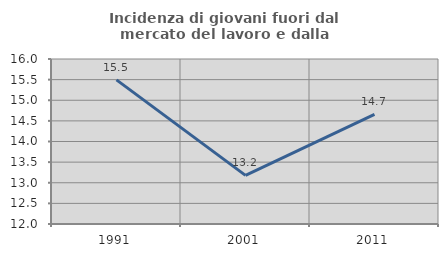
| Category | Incidenza di giovani fuori dal mercato del lavoro e dalla formazione  |
|---|---|
| 1991.0 | 15.493 |
| 2001.0 | 13.178 |
| 2011.0 | 14.655 |